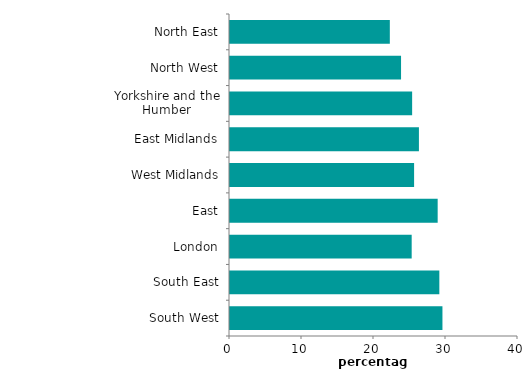
| Category | 2017-18 |
|---|---|
| North East | 22.198 |
| North West | 23.757 |
| Yorkshire and the Humber | 25.297 |
| East Midlands | 26.239 |
| West Midlands | 25.569 |
| East | 28.843 |
| London | 25.234 |
| South East | 29.075 |
| South West | 29.506 |